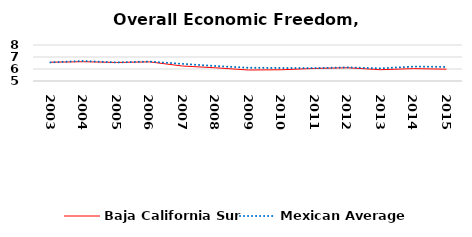
| Category | Baja California Sur | Mexican Average  |
|---|---|---|
| 2003.0 | 6.564 | 6.552 |
| 2004.0 | 6.607 | 6.668 |
| 2005.0 | 6.543 | 6.546 |
| 2006.0 | 6.595 | 6.619 |
| 2007.0 | 6.249 | 6.428 |
| 2008.0 | 6.101 | 6.248 |
| 2009.0 | 5.915 | 6.106 |
| 2010.0 | 5.938 | 6.086 |
| 2011.0 | 6.046 | 6.074 |
| 2012.0 | 6.102 | 6.134 |
| 2013.0 | 5.941 | 6.054 |
| 2014.0 | 6.032 | 6.2 |
| 2015.0 | 5.985 | 6.174 |